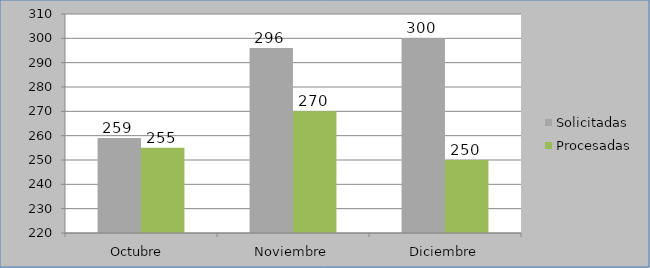
| Category | Solicitadas | Procesadas |
|---|---|---|
| Octubre  | 259 | 255 |
| Noviembre | 296 | 270 |
| Diciembre | 300 | 250 |